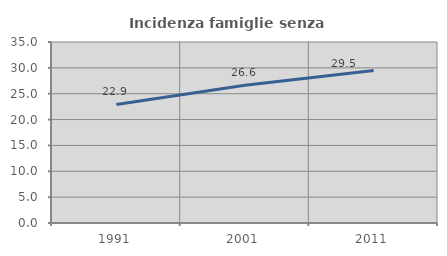
| Category | Incidenza famiglie senza nuclei |
|---|---|
| 1991.0 | 22.92 |
| 2001.0 | 26.642 |
| 2011.0 | 29.479 |